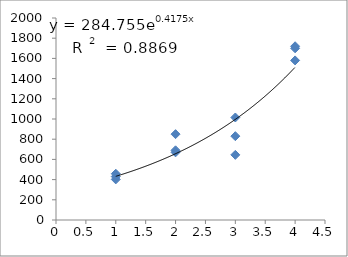
| Category | Series 0 |
|---|---|
| 1.0 | 430 |
| 1.0 | 458 |
| 1.0 | 402 |
| 2.0 | 850 |
| 2.0 | 670 |
| 2.0 | 690 |
| 3.0 | 1015 |
| 3.0 | 830 |
| 3.0 | 645 |
| 4.0 | 1720 |
| 4.0 | 1580 |
| 4.0 | 1700 |